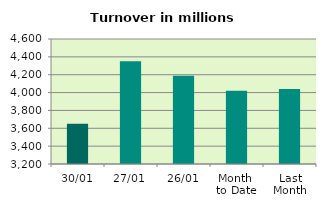
| Category | Series 0 |
|---|---|
| 30/01 | 3650.717 |
| 27/01 | 4351.735 |
| 26/01 | 4189.458 |
| Month 
to Date | 4021.781 |
| Last
Month | 4039.067 |